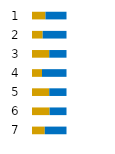
| Category | Series 0 | Series 1 | Series 2 |
|---|---|---|---|
| 0 | 39 |  | 61 |
| 1 | 31 |  | 69 |
| 2 | 50 |  | 50 |
| 3 | 29 |  | 71 |
| 4 | 50 |  | 50 |
| 5 | 51 |  | 49 |
| 6 | 37 |  | 63 |